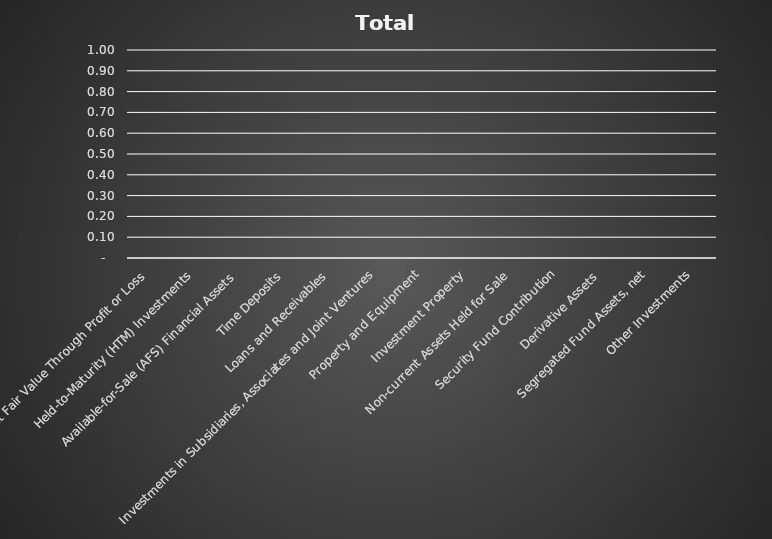
| Category | Series 0 |
|---|---|
| Financial Assets at Fair Value Through Profit or Loss | 0 |
| Held-to-Maturity (HTM) Investments | 0 |
| Available-for-Sale (AFS) Financial Assets | 0 |
| Time Deposits | 0 |
| Loans and Receivables | 0 |
| Investments in Subsidiaries, Associates and Joint Ventures | 0 |
| Property and Equipment | 0 |
| Investment Property | 0 |
| Non-current Assets Held for Sale | 0 |
| Security Fund Contribution | 0 |
| Derivative Assets | 0 |
| Segregated Fund Assets, net | 0 |
| Other Investments | 0 |